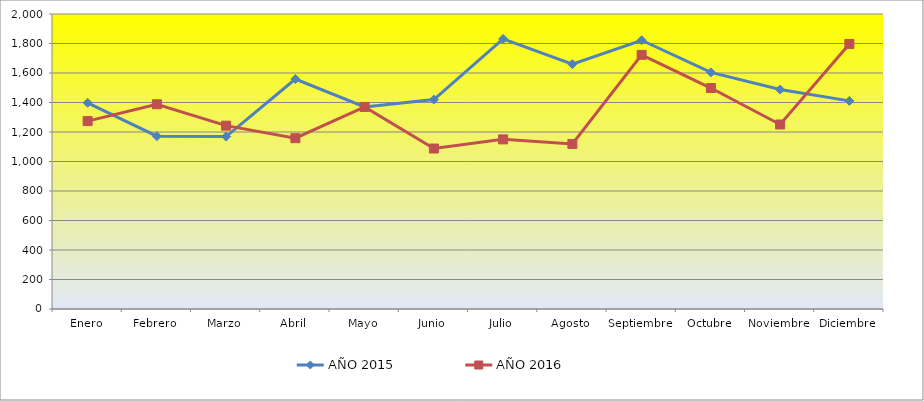
| Category | AÑO 2015 | AÑO 2016 |
|---|---|---|
| Enero | 1398 | 1274 |
| Febrero | 1172 | 1388 |
| Marzo | 1169 | 1243 |
| Abril | 1559 | 1158 |
| Mayo | 1370 | 1370 |
| Junio | 1420 | 1088 |
| Julio | 1831 | 1150 |
| Agosto | 1660 | 1119 |
| Septiembre | 1822 | 1723 |
| Octubre | 1604 | 1498 |
| Noviembre | 1488 | 1251 |
| Diciembre | 1411 | 1797 |